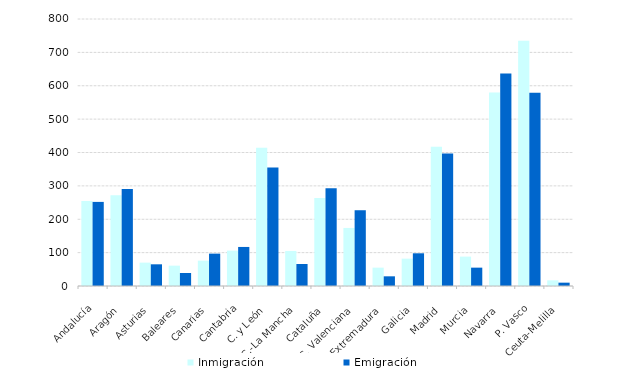
| Category | Inmigración  | Emigración |
|---|---|---|
| Andalucía | 255 | 252 |
| Aragón | 272 | 291 |
| Asturias | 70 | 65 |
| Baleares | 61 | 39 |
| Canarias | 76 | 97 |
| Cantabria | 106 | 117 |
| C. y León | 414 | 355 |
| C.-La Mancha | 105 | 66 |
| Cataluña | 264 | 293 |
| C. Valenciana | 174 | 227 |
| Extremadura | 55 | 29 |
| Galicia | 82 | 98 |
| Madrid | 417 | 397 |
| Murcia | 88 | 55 |
| Navarra | 580 | 637 |
| P. Vasco | 735 | 579 |
| Ceuta-Melilla | 17 | 10 |